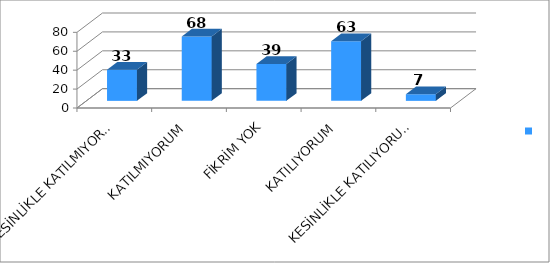
| Category | Series 0 |
|---|---|
| KESİNLİKLE KATILMIYORUM | 33 |
| KATILMIYORUM | 68 |
| FİKRİM YOK | 39 |
| KATILIYORUM | 63 |
| KESİNLİKLE KATILIYORUM | 7 |